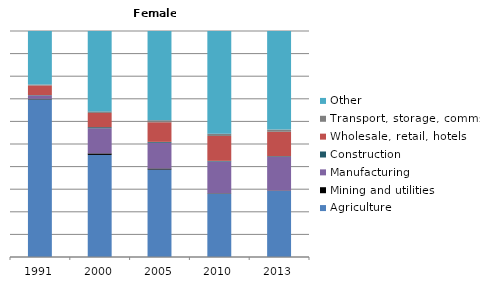
| Category | Agriculture | Mining and utilities | Manufacturing | Construction | Wholesale, retail, hotels | Transport, storage, comms | Other |
|---|---|---|---|---|---|---|---|
| 1991.0 | 69.8 | 0.3 | 1.4 | 0.2 | 4.3 | 0.4 | 23.7 |
| 2000.0 | 45.2 | 0.7 | 11.1 | 0.5 | 6.3 | 0.7 | 35.6 |
| 2005.0 | 38.8 | 0.5 | 11.4 | 0.4 | 8.7 | 0.9 | 39.6 |
| 2010.0 | 28 | 0.2 | 14 | 0.3 | 11 | 1 | 45.4 |
| 2013.0 | 29.2 | 0.2 | 14.9 | 0.3 | 10.8 | 1 | 43.6 |